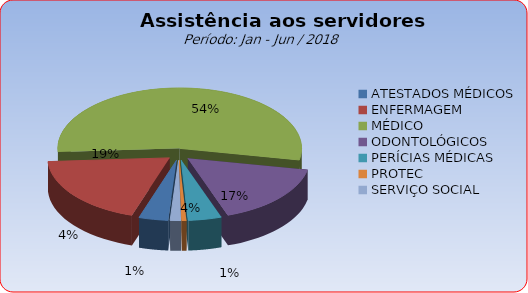
| Category | Series 0 |
|---|---|
| ATESTADOS MÉDICOS | 3.89 |
| ENFERMAGEM | 19.016 |
| MÉDICO | 54.056 |
| ODONTOLÓGICOS | 16.589 |
| PERÍCIAS MÉDICAS | 4.422 |
| PROTEC | 0.598 |
| SERVIÇO SOCIAL | 1.43 |